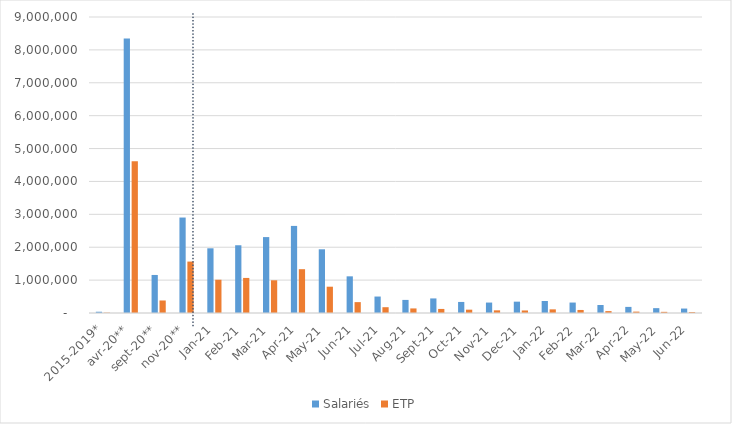
| Category | Salariés | ETP |
|---|---|---|
| 2015-2019* | 38310 | 10240 |
| avr-20** | 8346505 | 4613820 |
| sept-20** | 1156535 | 380545 |
| nov-20** | 2902650 | 1563595 |
| janv-21 | 1967285 | 1011950 |
| févr-21 | 2060125 | 1066330 |
| mars-21 | 2308425 | 994665 |
| avr-21 | 2648055 | 1332035 |
| mai-21 | 1936960 | 799600 |
| juin-21 | 1114755 | 330755 |
| juil-21 | 500550 | 176185 |
| août-21 | 397790 | 139030 |
| sept-21 | 443200 | 123535 |
| oct-21 | 336015 | 101330 |
| nov-21 | 317355 | 80910 |
| déc-21 | 344830 | 77160 |
| janv-22 | 364830 | 111060 |
| févr-22 | 317650 | 92390 |
| mars-22 | 242420 | 57510 |
| avr-22 | 185500 | 41985 |
| mai-22 | 147410 | 35200 |
| juin-22 | 135100 | 27815 |